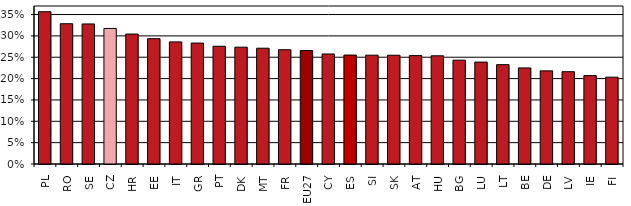
| Category | Series 0 |
|---|---|
| PL | 0.357 |
| RO | 0.328 |
| SE | 0.328 |
| CZ | 0.317 |
| HR | 0.304 |
| EE | 0.293 |
| IT | 0.286 |
| GR | 0.283 |
| PT | 0.276 |
| DK | 0.274 |
| MT | 0.271 |
| FR | 0.268 |
| EU27 | 0.266 |
| CY | 0.258 |
| ES | 0.255 |
| SI | 0.255 |
| SK | 0.255 |
| AT | 0.254 |
| HU | 0.253 |
| BG | 0.243 |
| LU | 0.239 |
| LT | 0.233 |
| BE | 0.225 |
| DE | 0.218 |
| LV | 0.216 |
| IE | 0.207 |
| FI | 0.203 |